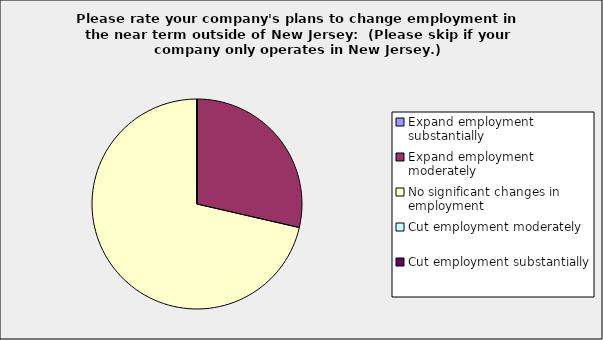
| Category | Series 0 |
|---|---|
| Expand employment substantially | 0 |
| Expand employment moderately | 0.286 |
| No significant changes in employment | 0.714 |
| Cut employment moderately | 0 |
| Cut employment substantially | 0 |